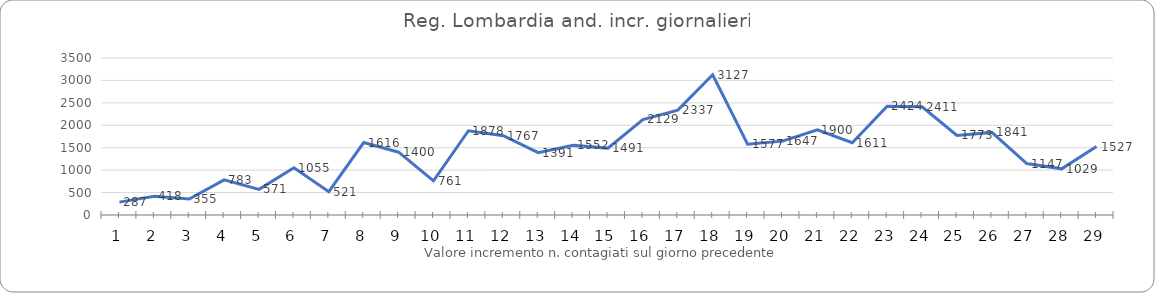
| Category | Series 0 |
|---|---|
| 0 | 287 |
| 1 | 418 |
| 2 | 355 |
| 3 | 783 |
| 4 | 571 |
| 5 | 1055 |
| 6 | 521 |
| 7 | 1616 |
| 8 | 1400 |
| 9 | 761 |
| 10 | 1878 |
| 11 | 1767 |
| 12 | 1391 |
| 13 | 1552 |
| 14 | 1491 |
| 15 | 2129 |
| 16 | 2337 |
| 17 | 3127 |
| 18 | 1577 |
| 19 | 1647 |
| 20 | 1900 |
| 21 | 1611 |
| 22 | 2424 |
| 23 | 2411 |
| 24 | 1773 |
| 25 | 1841 |
| 26 | 1147 |
| 27 | 1029 |
| 28 | 1527 |